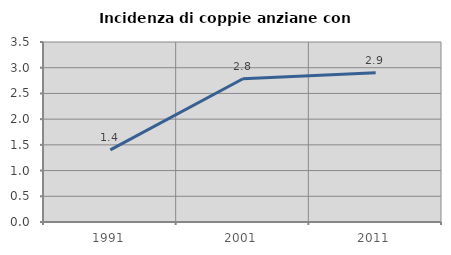
| Category | Incidenza di coppie anziane con figli |
|---|---|
| 1991.0 | 1.404 |
| 2001.0 | 2.786 |
| 2011.0 | 2.902 |